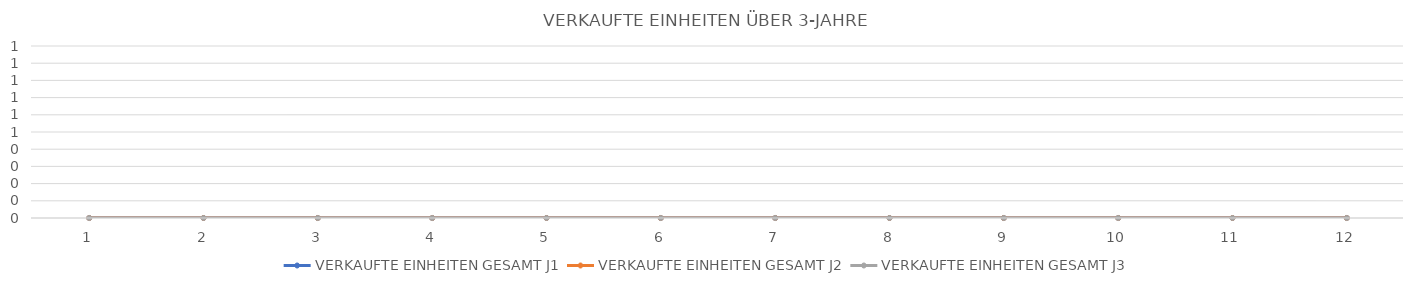
| Category | VERKAUFTE EINHEITEN GESAMT J1 | VERKAUFTE EINHEITEN GESAMT J2 | VERKAUFTE EINHEITEN GESAMT J3 |
|---|---|---|---|
| 0 | 0 | 0 | 0 |
| 1 | 0 | 0 | 0 |
| 2 | 0 | 0 | 0 |
| 3 | 0 | 0 | 0 |
| 4 | 0 | 0 | 0 |
| 5 | 0 | 0 | 0 |
| 6 | 0 | 0 | 0 |
| 7 | 0 | 0 | 0 |
| 8 | 0 | 0 | 0 |
| 9 | 0 | 0 | 0 |
| 10 | 0 | 0 | 0 |
| 11 | 0 | 0 | 0 |